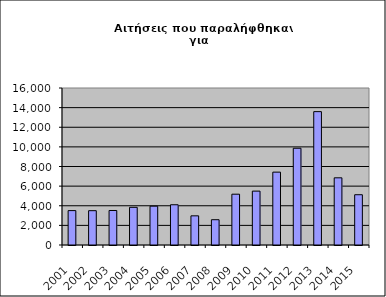
| Category | Series 0 |
|---|---|
| 2001.0 | 3505 |
| 2002.0 | 3497 |
| 2003.0 | 3516 |
| 2004.0 | 3838 |
| 2005.0 | 3956 |
| 2006.0 | 4101 |
| 2007.0 | 2972 |
| 2008.0 | 2577 |
| 2009.0 | 5177 |
| 2010.0 | 5491 |
| 2011.0 | 7426 |
| 2012.0 | 9860 |
| 2013.0 | 13592 |
| 2014.0 | 6846 |
| 2015.0 | 5123 |